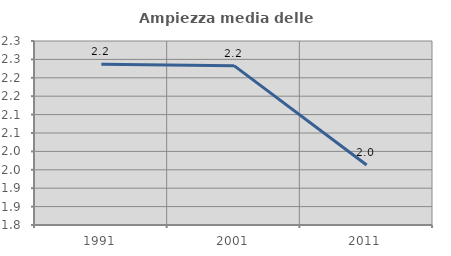
| Category | Ampiezza media delle famiglie |
|---|---|
| 1991.0 | 2.237 |
| 2001.0 | 2.233 |
| 2011.0 | 1.963 |